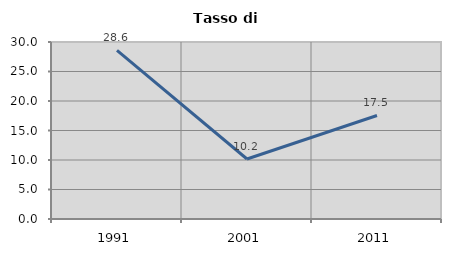
| Category | Tasso di disoccupazione   |
|---|---|
| 1991.0 | 28.571 |
| 2001.0 | 10.169 |
| 2011.0 | 17.544 |